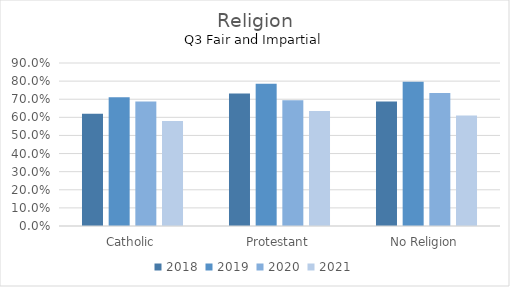
| Category | 2018 | 2019 | 2020 | 2021 |
|---|---|---|---|---|
| Catholic | 0.62 | 0.711 | 0.688 | 0.579 |
| Protestant | 0.732 | 0.785 | 0.695 | 0.635 |
| No Religion | 0.687 | 0.797 | 0.735 | 0.61 |